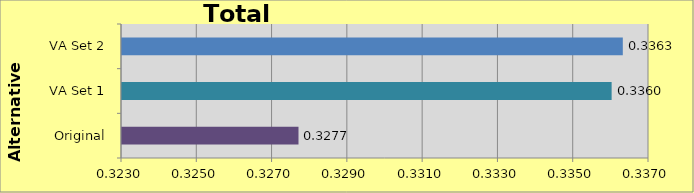
| Category | Original VA Set 1 VA Set 2 |
|---|---|
| Original | 0.328 |
| VA Set 1 | 0.336 |
| VA Set 2 | 0.336 |